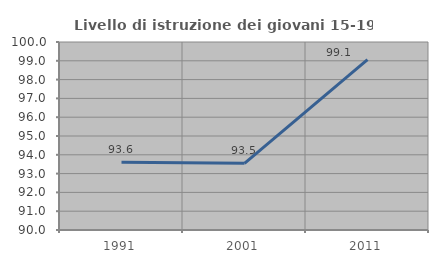
| Category | Livello di istruzione dei giovani 15-19 anni |
|---|---|
| 1991.0 | 93.6 |
| 2001.0 | 93.548 |
| 2011.0 | 99.061 |